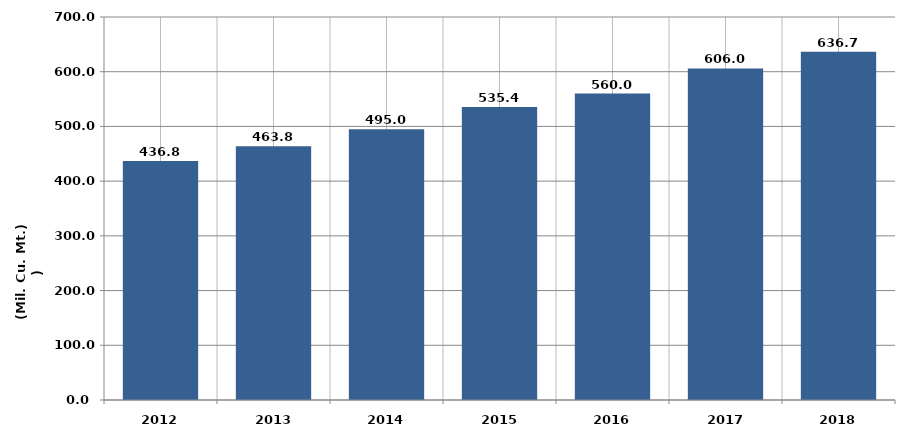
| Category |  انتاج المياه 
( مليون متر مكعب  ) Water Production
(Million Cubic Meters) |
|---|---|
| 2012 | 436.8 |
| 2013 | 463.8 |
| 2014 | 494.961 |
| 2015 | 535.4 |
| 2016 | 560 |
| 2017 | 606 |
| 2018 | 636.7 |